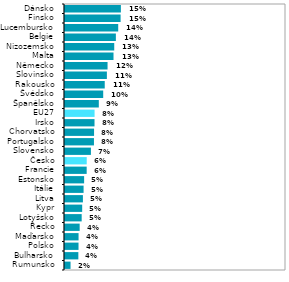
| Category | Series 1 |
|---|---|
| Rumunsko | 0.015 |
| Bulharsko | 0.036 |
| Polsko | 0.037 |
| Maďarsko | 0.037 |
| Řecko | 0.04 |
| Lotyšsko | 0.045 |
| Kypr | 0.047 |
| Litva | 0.049 |
| Itálie | 0.05 |
| Estonsko | 0.052 |
| Francie | 0.059 |
| Česko | 0.059 |
| Slovensko | 0.07 |
| Portugalsko | 0.079 |
| Chorvatsko | 0.079 |
| Irsko | 0.08 |
| EU27 | 0.08 |
| Španělsko | 0.092 |
| Švédsko | 0.104 |
| Rakousko | 0.108 |
| Slovinsko | 0.114 |
| Německo | 0.116 |
| Malta | 0.132 |
| Nizozemsko | 0.134 |
| Belgie | 0.138 |
| Lucembursko | 0.144 |
| Finsko | 0.151 |
| Dánsko | 0.152 |